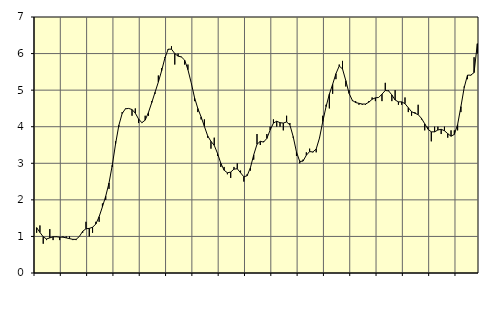
| Category | Piggar | Series 1 |
|---|---|---|
| nan | 1.1 | 1.24 |
| 87.0 | 1.3 | 1.11 |
| 87.0 | 0.8 | 0.99 |
| 87.0 | 0.9 | 0.93 |
| nan | 1.2 | 0.96 |
| 88.0 | 0.9 | 0.99 |
| 88.0 | 1 | 0.99 |
| 88.0 | 0.9 | 0.98 |
| nan | 1 | 0.98 |
| 89.0 | 1 | 0.96 |
| 89.0 | 1 | 0.94 |
| 89.0 | 0.9 | 0.92 |
| nan | 0.9 | 0.92 |
| 90.0 | 1 | 1 |
| 90.0 | 1.1 | 1.14 |
| 90.0 | 1.4 | 1.21 |
| nan | 1 | 1.22 |
| 91.0 | 1.1 | 1.25 |
| 91.0 | 1.4 | 1.34 |
| 91.0 | 1.4 | 1.54 |
| nan | 1.9 | 1.81 |
| 92.0 | 2 | 2.1 |
| 92.0 | 2.3 | 2.46 |
| 92.0 | 2.9 | 2.95 |
| nan | 3.6 | 3.53 |
| 93.0 | 4 | 4.04 |
| 93.0 | 4.4 | 4.36 |
| 93.0 | 4.5 | 4.49 |
| nan | 4.5 | 4.5 |
| 94.0 | 4.3 | 4.47 |
| 94.0 | 4.5 | 4.37 |
| 94.0 | 4.1 | 4.21 |
| nan | 4.1 | 4.11 |
| 95.0 | 4.3 | 4.18 |
| 95.0 | 4.3 | 4.39 |
| 95.0 | 4.7 | 4.66 |
| nan | 4.9 | 4.94 |
| 96.0 | 5.4 | 5.22 |
| 96.0 | 5.6 | 5.53 |
| 96.0 | 5.9 | 5.88 |
| nan | 6.1 | 6.12 |
| 97.0 | 6.2 | 6.12 |
| 97.0 | 5.7 | 6 |
| 97.0 | 6 | 5.93 |
| nan | 5.9 | 5.91 |
| 98.0 | 5.7 | 5.82 |
| 98.0 | 5.7 | 5.56 |
| 98.0 | 5.2 | 5.2 |
| nan | 4.7 | 4.8 |
| 99.0 | 4.4 | 4.5 |
| 99.0 | 4.2 | 4.27 |
| 99.0 | 4.2 | 4.01 |
| nan | 3.7 | 3.75 |
| 0.0 | 3.4 | 3.6 |
| 0.0 | 3.7 | 3.49 |
| 0.0 | 3.2 | 3.27 |
| nan | 2.9 | 3 |
| 1.0 | 2.9 | 2.81 |
| 1.0 | 2.7 | 2.74 |
| 1.0 | 2.6 | 2.76 |
| nan | 2.9 | 2.84 |
| 2.0 | 3 | 2.85 |
| 2.0 | 2.8 | 2.74 |
| 2.0 | 2.5 | 2.63 |
| nan | 2.7 | 2.66 |
| 3.0 | 2.8 | 2.88 |
| 3.0 | 3.1 | 3.23 |
| 3.0 | 3.8 | 3.52 |
| nan | 3.5 | 3.6 |
| 4.0 | 3.6 | 3.58 |
| 4.0 | 3.8 | 3.68 |
| 4.0 | 4 | 3.91 |
| nan | 4.2 | 4.1 |
| 5.0 | 4 | 4.15 |
| 5.0 | 4 | 4.11 |
| 5.0 | 3.9 | 4.1 |
| nan | 4.3 | 4.13 |
| 6.0 | 4.1 | 4.05 |
| 6.0 | 3.7 | 3.73 |
| 6.0 | 3.2 | 3.31 |
| nan | 3 | 3.05 |
| 7.0 | 3.1 | 3.06 |
| 7.0 | 3.3 | 3.22 |
| 7.0 | 3.4 | 3.32 |
| nan | 3.3 | 3.31 |
| 8.0 | 3.3 | 3.39 |
| 8.0 | 3.7 | 3.69 |
| 8.0 | 4.3 | 4.14 |
| nan | 4.6 | 4.55 |
| 9.0 | 4.5 | 4.89 |
| 9.0 | 4.9 | 5.16 |
| 9.0 | 5.3 | 5.45 |
| nan | 5.7 | 5.66 |
| 10.0 | 5.8 | 5.58 |
| 10.0 | 5.1 | 5.26 |
| 10.0 | 5 | 4.91 |
| nan | 4.7 | 4.72 |
| 11.0 | 4.7 | 4.66 |
| 11.0 | 4.6 | 4.64 |
| 11.0 | 4.6 | 4.62 |
| nan | 4.6 | 4.62 |
| 12.0 | 4.7 | 4.67 |
| 12.0 | 4.8 | 4.75 |
| 12.0 | 4.7 | 4.79 |
| nan | 4.8 | 4.8 |
| 13.0 | 4.7 | 4.89 |
| 13.0 | 5.2 | 4.99 |
| 13.0 | 5 | 4.98 |
| nan | 4.7 | 4.87 |
| 14.0 | 5 | 4.73 |
| 14.0 | 4.6 | 4.68 |
| 14.0 | 4.6 | 4.68 |
| nan | 4.8 | 4.63 |
| 15.0 | 4.4 | 4.52 |
| 15.0 | 4.3 | 4.41 |
| 15.0 | 4.4 | 4.37 |
| nan | 4.6 | 4.33 |
| 16.0 | 4.2 | 4.23 |
| 16.0 | 3.9 | 4.08 |
| 16.0 | 4 | 3.93 |
| nan | 3.6 | 3.86 |
| 17.0 | 4 | 3.86 |
| 17.0 | 4 | 3.91 |
| 17.0 | 3.8 | 3.93 |
| nan | 4 | 3.89 |
| 18.0 | 3.7 | 3.81 |
| 18.0 | 3.9 | 3.74 |
| 18.0 | 3.9 | 3.79 |
| nan | 3.9 | 4.06 |
| 19.0 | 4.4 | 4.55 |
| 19.0 | 5.1 | 5.07 |
| 19.0 | 5.3 | 5.41 |
| nan | 5.4 | 5.41 |
| 20.0 | 5.9 | 5.48 |
| 20.0 | 6 | 6.27 |